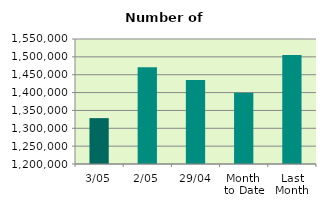
| Category | Series 0 |
|---|---|
| 3/05 | 1328442 |
| 2/05 | 1470690 |
| 29/04 | 1435050 |
| Month 
to Date | 1399566 |
| Last
Month | 1505043.474 |